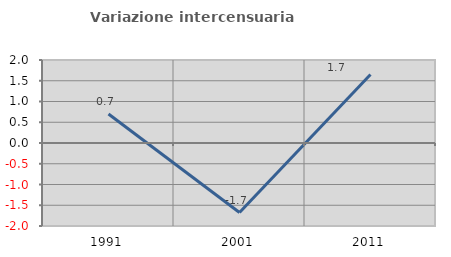
| Category | Variazione intercensuaria annua |
|---|---|
| 1991.0 | 0.7 |
| 2001.0 | -1.675 |
| 2011.0 | 1.651 |